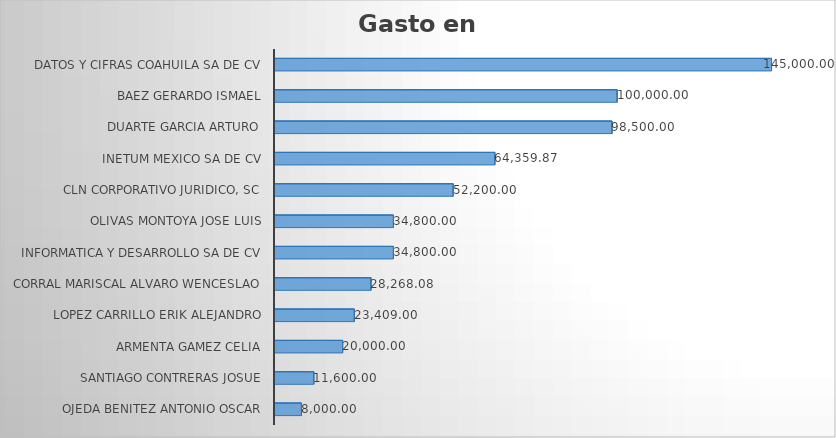
| Category | Suma  |
|---|---|
| OJEDA BENITEZ ANTONIO OSCAR | 8000 |
| SANTIAGO CONTRERAS JOSUE | 11600 |
| ARMENTA GAMEZ CELIA | 20000 |
| LOPEZ CARRILLO ERIK ALEJANDRO | 23409 |
| CORRAL MARISCAL ALVARO WENCESLAO | 28268.08 |
| INFORMATICA Y DESARROLLO SA DE CV | 34800 |
| OLIVAS MONTOYA JOSE LUIS | 34800 |
| CLN CORPORATIVO JURIDICO, SC | 52200 |
| INETUM MEXICO SA DE CV | 64359.87 |
| DUARTE GARCIA ARTURO | 98500 |
| BAEZ GERARDO ISMAEL | 100000 |
| DATOS Y CIFRAS COAHUILA SA DE CV | 145000 |